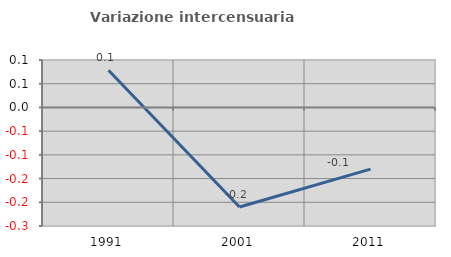
| Category | Variazione intercensuaria annua |
|---|---|
| 1991.0 | 0.078 |
| 2001.0 | -0.21 |
| 2011.0 | -0.13 |